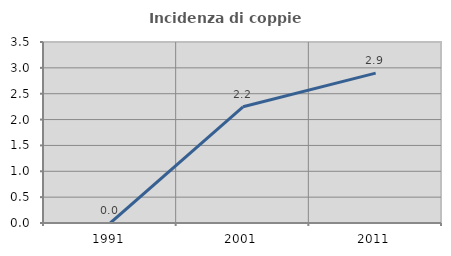
| Category | Incidenza di coppie miste |
|---|---|
| 1991.0 | 0 |
| 2001.0 | 2.247 |
| 2011.0 | 2.899 |